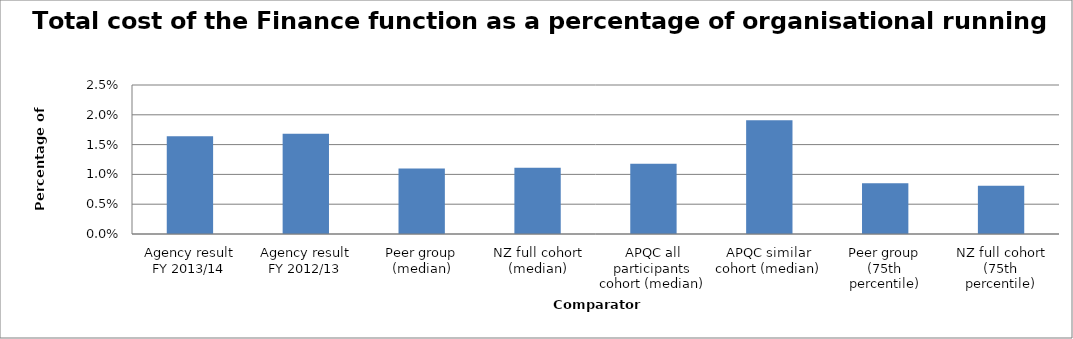
| Category | Result |
|---|---|
| Agency result
FY 2013/14 | 0.016 |
| Agency result
FY 2012/13 | 0.017 |
| Peer group (median) | 0.011 |
| NZ full cohort (median) | 0.011 |
| APQC all participants cohort (median) | 0.012 |
| APQC similar cohort (median) | 0.019 |
| Peer group (75th percentile) | 0.008 |
| NZ full cohort (75th percentile) | 0.008 |